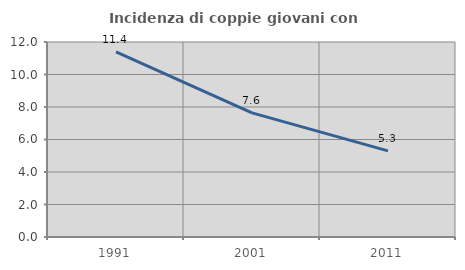
| Category | Incidenza di coppie giovani con figli |
|---|---|
| 1991.0 | 11.389 |
| 2001.0 | 7.635 |
| 2011.0 | 5.303 |